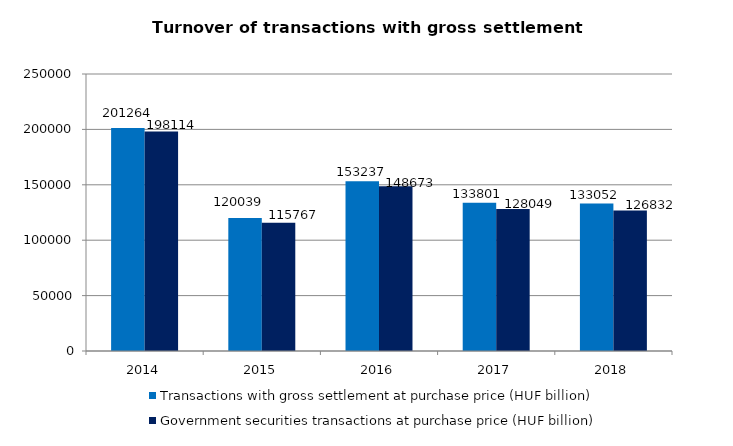
| Category | Transactions with gross settlement at purchase price (HUF billion) | Government securities transactions at purchase price (HUF billion) |
|---|---|---|
| 2014.0 | 201264 | 198114 |
| 2015.0 | 120039 | 115767 |
| 2016.0 | 153237 | 148673 |
| 2017.0 | 133801 | 128049 |
| 2018.0 | 133052 | 126832 |